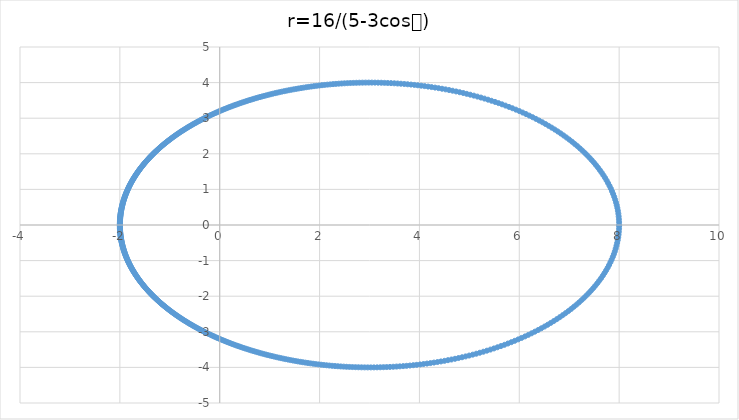
| Category | Series 0 |
|---|---|
| 8.0 | 0 |
| 7.999000083326431 | 0.08 |
| 7.9960013328917 | 0.16 |
| 7.991006744971623 | 0.24 |
| 7.984021305096987 | 0.32 |
| 7.975051975700377 | 0.399 |
| 7.964107678901756 | 0.478 |
| 7.95119927451213 | 0.557 |
| 7.936339533356246 | 0.636 |
| 7.919543106036231 | 0.715 |
| 7.900826487278052 | 0.793 |
| 7.880207976021677 | 0.87 |
| 7.85770763143369 | 0.947 |
| 7.83334722503755 | 1.024 |
| 7.807150189172043 | 1.1 |
| 7.779141562002014 | 1.176 |
| 7.749347929317744 | 1.251 |
| 7.717797363369854 | 1.325 |
| 7.684519358995629 | 1.398 |
| 7.649544767299798 | 1.471 |
| 7.612905727158514 | 1.543 |
| 7.574635594819063 | 1.614 |
| 7.534768871870203 | 1.685 |
| 7.493341131858488 | 1.755 |
| 7.450388945825134 | 1.823 |
| 7.405949807035291 | 1.891 |
| 7.360062055167811 | 1.958 |
| 7.312764800228125 | 2.024 |
| 7.264097846440236 | 2.089 |
| 7.214101616366028 | 2.153 |
| 7.162817075491111 | 2.216 |
| 7.110285657506487 | 2.278 |
| 7.056549190504545 | 2.338 |
| 7.001649824296235 | 2.398 |
| 6.945629959044046 | 2.457 |
| 6.888532175392632 | 2.515 |
| 6.830399166265657 | 2.571 |
| 6.771273670483854 | 2.626 |
| 6.711198408345566 | 2.681 |
| 6.650216019297045 | 2.734 |
| 6.588369001805932 | 2.786 |
| 6.525699655537476 | 2.836 |
| 6.462250025919277 | 2.886 |
| 6.398061851167021 | 2.934 |
| 6.333176511830353 | 2.982 |
| 6.26763498290546 | 3.028 |
| 6.201477788548398 | 3.073 |
| 6.134744959411527 | 3.116 |
| 6.067475992613994 | 3.159 |
| 5.999709814346535 | 3.2 |
| 5.931484745100645 | 3.24 |
| 5.862838467502768 | 3.279 |
| 5.793807996725204 | 3.317 |
| 5.724429653437246 | 3.354 |
| 5.654739039252534 | 3.39 |
| 5.58477101462171 | 3.424 |
| 5.514559679113258 | 3.457 |
| 5.444138354019811 | 3.49 |
| 5.373539567222341 | 3.521 |
| 5.302795040240249 | 3.551 |
| 5.231935677391793 | 3.579 |
| 5.160991556986063 | 3.607 |
| 5.089991924465212 | 3.634 |
| 5.01896518741366 | 3.659 |
| 4.947938912349361 | 3.684 |
| 4.87693982321131 | 3.707 |
| 4.805993801456769 | 3.73 |
| 4.735125887681586 | 3.751 |
| 4.664360284677105 | 3.772 |
| 4.59372036183784 | 3.791 |
| 4.52322866083485 | 3.81 |
| 4.452906902471033 | 3.827 |
| 4.382775994635963 | 3.844 |
| 4.312856041279559 | 3.86 |
| 4.243166352325852 | 3.874 |
| 4.17372545445011 | 3.888 |
| 4.104551102644868 | 3.901 |
| 4.03566029250281 | 3.913 |
| 3.967069273146864 | 3.924 |
| 3.898793560740561 | 3.935 |
| 3.830847952514242 | 3.944 |
| 3.763246541245501 | 3.953 |
| 3.69600273013495 | 3.961 |
| 3.629129248021127 | 3.968 |
| 3.562638164881205 | 3.975 |
| 3.496540907566835 | 3.98 |
| 3.430848275727262 | 3.985 |
| 3.3655704578745 | 3.989 |
| 3.300717047548056 | 3.993 |
| 3.236297059539306 | 3.996 |
| 3.172318946138137 | 3.998 |
| 3.108790613367034 | 3.999 |
| 3.045719437170157 | 4 |
| 2.98311227952733 | 4 |
| 2.920975504465138 | 4 |
| 2.859314993939508 | 3.998 |
| 2.798136163566281 | 3.997 |
| 2.737443978178282 | 3.994 |
| 2.677242967189345 | 3.992 |
| 2.617537239747617 | 3.988 |
| 2.558330499662216 | 3.984 |
| 2.499626060088969 | 3.98 |
| 2.441426857962642 | 3.975 |
| 2.38373546816446 | 3.97 |
| 2.326554117415242 | 3.964 |
| 2.269884697885776 | 3.957 |
| 2.21372878051733 | 3.95 |
| 2.158087628046377 | 3.943 |
| 2.102962207728762 | 3.935 |
| 2.048353203759508 | 3.927 |
| 1.994261029385514 | 3.918 |
| 1.940685838709213 | 3.909 |
| 1.887627538182174 | 3.9 |
| 1.83508579778834 | 3.89 |
| 1.783060061917342 | 3.88 |
| 1.73154955992899 | 3.869 |
| 1.680553316410609 | 3.858 |
| 1.630070161129488 | 3.847 |
| 1.580098738683143 | 3.835 |
| 1.530637517850628 | 3.823 |
| 1.481684800648471 | 3.811 |
| 1.433238731095203 | 3.799 |
| 1.385297303688793 | 3.786 |
| 1.337858371601562 | 3.773 |
| 1.290919654597419 | 3.759 |
| 1.244478746676498 | 3.745 |
| 1.198533123452443 | 3.731 |
| 1.153080149267762 | 3.717 |
| 1.108117084052829 | 3.703 |
| 1.063641089934184 | 3.688 |
| 1.019649237597914 | 3.673 |
| 0.976138512413934 | 3.658 |
| 0.933105820327067 | 3.642 |
| 0.890547993520809 | 3.627 |
| 0.848461795859741 | 3.611 |
| 0.806843928116486 | 3.595 |
| 0.765691032989141 | 3.578 |
| 0.72499969991506 | 3.562 |
| 0.684766469686844 | 3.545 |
| 0.64498783887633 | 3.529 |
| 0.605660264072313 | 3.512 |
| 0.566780165937688 | 3.494 |
| 0.528343933091595 | 3.477 |
| 0.490347925822092 | 3.46 |
| 0.452788479634787 | 3.442 |
| 0.415661908642756 | 3.424 |
| 0.378964508803 | 3.406 |
| 0.342692561004577 | 3.388 |
| 0.306842334013438 | 3.37 |
| 0.271410087278916 | 3.352 |
| 0.236392073606662 | 3.333 |
| 0.201784541702767 | 3.315 |
| 0.167583738593651 | 3.296 |
| 0.133785911926214 | 3.278 |
| 0.100387312152616 | 3.259 |
| 0.0673841946039558 | 3.24 |
| 0.0347728214569896 | 3.221 |
| 0.00254946359791953 | 3.202 |
| -0.0292895976128169 | 3.182 |
| -0.0607480686709527 | 3.163 |
| -0.0918296423502916 | 3.144 |
| -0.122537996212512 | 3.124 |
| -0.152876791201394 | 3.105 |
| -0.182849670318087 | 3.085 |
| -0.212460257374163 | 3.065 |
| -0.241712155819265 | 3.045 |
| -0.270608947640309 | 3.026 |
| -0.299154192329247 | 3.006 |
| -0.32735142591655 | 2.986 |
| -0.355204160067608 | 2.966 |
| -0.38271588123939 | 2.946 |
| -0.40989004989476 | 2.925 |
| -0.436730099771957 | 2.905 |
| -0.463239437206823 | 2.885 |
| -0.489421440505444 | 2.865 |
| -0.515279459364973 | 2.845 |
| -0.540816814340458 | 2.824 |
| -0.566036796355586 | 2.804 |
| -0.590942666255347 | 2.783 |
| -0.61553765439866 | 2.763 |
| -0.639824960289117 | 2.742 |
| -0.663807752242032 | 2.722 |
| -0.687489167086079 | 2.701 |
| -0.710872309897848 | 2.681 |
| -0.733960253767731 | 2.66 |
| -0.756756039595591 | 2.64 |
| -0.779262675914741 | 2.619 |
| -0.801483138742811 | 2.598 |
| -0.82342037145815 | 2.578 |
| -0.845077284700431 | 2.557 |
| -0.866456756294225 | 2.536 |
| -0.887561631194328 | 2.515 |
| -0.908394721451674 | 2.495 |
| -0.928958806198736 | 2.474 |
| -0.949256631653348 | 2.453 |
| -0.969290911139911 | 2.432 |
| -0.989064325127025 | 2.412 |
| -1.008579521280597 | 2.391 |
| -1.02783911453152 | 2.37 |
| -1.046845687157074 | 2.349 |
| -1.06560178887522 | 2.328 |
| -1.08410993695099 | 2.308 |
| -1.102372616314229 | 2.287 |
| -1.120392279687954 | 2.266 |
| -1.138171347726648 | 2.245 |
| -1.155712209163827 | 2.224 |
| -1.173017220968233 | 2.203 |
| -1.190088708508073 | 2.183 |
| -1.206928965722706 | 2.162 |
| -1.223540255301232 | 2.141 |
| -1.239924808867465 | 2.12 |
| -1.25608482717077 | 2.099 |
| -1.272022480282303 | 2.078 |
| -1.287739907796181 | 2.058 |
| -1.30323921903515 | 2.037 |
| -1.31852249326034 | 2.016 |
| -1.333591779884699 | 1.995 |
| -1.348449098689737 | 1.974 |
| -1.363096440045217 | 1.954 |
| -1.377535765131444 | 1.933 |
| -1.391769006163834 | 1.912 |
| -1.405798066619444 | 1.891 |
| -1.419624821465179 | 1.871 |
| -1.433251117387374 | 1.85 |
| -1.446678773022507 | 1.829 |
| -1.459909579188773 | 1.808 |
| -1.472945299118284 | 1.788 |
| -1.485787668689663 | 1.767 |
| -1.498438396660819 | 1.746 |
| -1.510899164901693 | 1.725 |
| -1.523171628626774 | 1.705 |
| -1.535257416627222 | 1.684 |
| -1.547158131502385 | 1.663 |
| -1.558875349890582 | 1.643 |
| -1.570410622698972 | 1.622 |
| -1.581765475332368 | 1.601 |
| -1.592941407920847 | 1.581 |
| -1.603939895546044 | 1.56 |
| -1.614762388465974 | 1.54 |
| -1.625410312338298 | 1.519 |
| -1.635885068441889 | 1.498 |
| -1.646188033896617 | 1.478 |
| -1.656320561881245 | 1.457 |
| -1.666283981849342 | 1.437 |
| -1.676079599743127 | 1.416 |
| -1.685708698205162 | 1.396 |
| -1.695172536787823 | 1.375 |
| -1.704472352160464 | 1.355 |
| -1.713609358314217 | 1.334 |
| -1.722584746764367 | 1.314 |
| -1.731399686750231 | 1.293 |
| -1.740055325432494 | 1.273 |
| -1.748552788087957 | 1.253 |
| -1.756893178301636 | 1.232 |
| -1.765077578156173 | 1.212 |
| -1.773107048418526 | 1.191 |
| -1.780982628723888 | 1.171 |
| -1.788705337756806 | 1.151 |
| -1.796276173429467 | 1.13 |
| -1.803696113057123 | 1.11 |
| -1.810966113530622 | 1.089 |
| -1.818087111486025 | 1.069 |
| -1.825060023471289 | 1.049 |
| -1.831885746109981 | 1.029 |
| -1.838565156262027 | 1.008 |
| -1.845099111181452 | 0.988 |
| -1.851488448671123 | 0.968 |
| -1.85773398723446 | 0.947 |
| -1.863836526224112 | 0.927 |
| -1.869796845987584 | 0.907 |
| -1.875615708009815 | 0.887 |
| -1.881293855052686 | 0.866 |
| -1.886832011291454 | 0.846 |
| -1.89223088244811 | 0.826 |
| -1.897491155921661 | 0.806 |
| -1.902613500915314 | 0.786 |
| -1.907598568560578 | 0.765 |
| -1.912446992038271 | 0.745 |
| -1.917159386696434 | 0.725 |
| -1.921736350165148 | 0.705 |
| -1.926178462468256 | 0.685 |
| -1.930486286131997 | 0.665 |
| -1.934660366290532 | 0.645 |
| -1.938701230788387 | 0.624 |
| -1.942609390279804 | 0.604 |
| -1.946385338324997 | 0.584 |
| -1.950029551483328 | 0.564 |
| -1.953542489403386 | 0.544 |
| -1.956924594910001 | 0.524 |
| -1.960176294088164 | 0.504 |
| -1.963297996363878 | 0.484 |
| -1.966290094581938 | 0.464 |
| -1.969152965080639 | 0.444 |
| -1.971886967763417 | 0.424 |
| -1.974492446167435 | 0.404 |
| -1.976969727529102 | 0.383 |
| -1.979319122846547 | 0.363 |
| -1.981540926939035 | 0.343 |
| -1.983635418503334 | 0.323 |
| -1.98560286016705 | 0.303 |
| -1.987443498538906 | 0.283 |
| -1.989157564255999 | 0.263 |
| -1.990745272028008 | 0.243 |
| -1.992206820678387 | 0.223 |
| -1.993542393182515 | 0.203 |
| -1.994752156702835 | 0.183 |
| -1.995836262620958 | 0.163 |
| -1.996794846566756 | 0.143 |
| -1.997628028444435 | 0.123 |
| -1.998335912455587 | 0.103 |
| -1.998918587119235 | 0.083 |
| -1.999376125288862 | 0.063 |
| -1.999708584166431 | 0.043 |
| -1.999916005313388 | 0.023 |
| -1.999998414658671 | 0.003 |
| -1.99995582250369 | -0.017 |
| -1.99978822352432 | -0.037 |
| -1.999495596769871 | -0.057 |
| -1.999077905659052 | -0.077 |
| -1.998535097972939 | -0.097 |
| -1.997867105844915 | -0.117 |
| -1.997073845747619 | -0.137 |
| -1.99615521847687 | -0.157 |
| -1.995111109132584 | -0.177 |
| -1.993941387096685 | -0.197 |
| -1.992645906007986 | -0.217 |
| -1.991224503734066 | -0.237 |
| -1.98967700234012 | -0.257 |
| -1.988003208054789 | -0.277 |
| -1.986202911232971 | -0.297 |
| -1.984275886315596 | -0.317 |
| -1.982221891786376 | -0.337 |
| -1.980040670125527 | -0.357 |
| -1.977731947760442 | -0.377 |
| -1.975295435013341 | -0.397 |
| -1.972730826045865 | -0.417 |
| -1.970037798800629 | -0.437 |
| -1.967216014939728 | -0.457 |
| -1.964265119780182 | -0.477 |
| -1.961184742226334 | -0.497 |
| -1.95797449469918 | -0.518 |
| -1.954633973062634 | -0.538 |
| -1.951162756546734 | -0.558 |
| -1.947560407667765 | -0.578 |
| -1.943826472145317 | -0.598 |
| -1.939960478816261 | -0.618 |
| -1.93596193954564 | -0.638 |
| -1.931830349134487 | -0.658 |
| -1.927565185224543 | -0.678 |
| -1.923165908199897 | -0.699 |
| -1.91863196108553 | -0.719 |
| -1.913962769442765 | -0.739 |
| -1.909157741261626 | -0.759 |
| -1.904216266850101 | -0.779 |
| -1.899137718720309 | -0.799 |
| -1.893921451471573 | -0.82 |
| -1.8885668016704 | -0.84 |
| -1.88307308772736 | -0.86 |
| -1.877439609770888 | -0.88 |
| -1.871665649517986 | -0.9 |
| -1.865750470141846 | -0.921 |
| -1.859693316136392 | -0.941 |
| -1.853493413177754 | -0.961 |
| -1.847149967982666 | -0.981 |
| -1.840662168163807 | -1.002 |
| -1.834029182082099 | -1.022 |
| -1.827250158695959 | -1.042 |
| -1.82032422740752 | -1.063 |
| -1.813250497905845 | -1.083 |
| -1.806028060007136 | -1.103 |
| -1.798655983491958 | -1.124 |
| -1.791133317939506 | -1.144 |
| -1.783459092558915 | -1.164 |
| -1.775632316017655 | -1.185 |
| -1.76765197626703 | -1.205 |
| -1.759517040364794 | -1.226 |
| -1.751226454294933 | -1.246 |
| -1.742779142784637 | -1.266 |
| -1.734174009118485 | -1.287 |
| -1.725409934949898 | -1.307 |
| -1.716485780109891 | -1.328 |
| -1.707400382413165 | -1.348 |
| -1.69815255746159 | -1.369 |
| -1.688741098445125 | -1.389 |
| -1.679164775940243 | -1.41 |
| -1.669422337705886 | -1.43 |
| -1.659512508477051 | -1.451 |
| -1.649433989756047 | -1.471 |
| -1.6391854596015 | -1.492 |
| -1.628765572415189 | -1.513 |
| -1.618172958726776 | -1.533 |
| -1.60740622497654 | -1.554 |
| -1.596463953296177 | -1.574 |
| -1.585344701287795 | -1.595 |
| -1.574047001801171 | -1.616 |
| -1.562569362709421 | -1.636 |
| -1.550910266683154 | -1.657 |
| -1.539068170963273 | -1.677 |
| -1.527041507132524 | -1.698 |
| -1.514828680885951 | -1.719 |
| -1.502428071800386 | -1.74 |
| -1.489838033103152 | -1.76 |
| -1.477056891440107 | -1.781 |
| -1.464082946643241 | -1.802 |
| -1.450914471497978 | -1.822 |
| -1.437549711510389 | -1.843 |
| -1.42398688467452 | -1.864 |
| -1.410224181240038 | -1.885 |
| -1.396259763480436 | -1.905 |
| -1.382091765462016 | -1.926 |
| -1.367718292813919 | -1.947 |
| -1.353137422499452 | -1.968 |
| -1.338347202588989 | -1.989 |
| -1.323345652034748 | -2.009 |
| -1.308130760447739 | -2.03 |
| -1.292700487877208 | -2.051 |
| -1.277052764592919 | -2.072 |
| -1.261185490870622 | -2.093 |
| -1.245096536781088 | -2.113 |
| -1.22878374198309 | -2.134 |
| -1.212244915520759 | -2.155 |
| -1.19547783562572 | -2.176 |
| -1.178480249524487 | -2.197 |
| -1.161249873251566 | -2.218 |
| -1.143784391468778 | -2.238 |
| -1.126081457291313 | -2.259 |
| -1.10813869212106 | -2.28 |
| -1.089953685487786 | -2.301 |
| -1.07152399489875 | -2.322 |
| -1.052847145697391 | -2.343 |
| -1.033920630931727 | -2.363 |
| -1.014741911233156 | -2.384 |
| -0.995308414706367 | -2.405 |
| -0.97561753683111 | -2.426 |
| -0.955666640376606 | -2.447 |
| -0.935453055329395 | -2.467 |
| -0.914974078835499 | -2.488 |
| -0.894226975157757 | -2.509 |
| -0.873208975649286 | -2.53 |
| -0.851917278744005 | -2.55 |
| -0.830349049965263 | -2.571 |
| -0.808501421953592 | -2.592 |
| -0.786371494514703 | -2.612 |
| -0.763956334688854 | -2.633 |
| -0.741252976842795 | -2.654 |
| -0.718258422785515 | -2.674 |
| -0.694969641909098 | -2.695 |
| -0.671383571356027 | -2.715 |
| -0.647497116214339 | -2.736 |
| -0.623307149742092 | -2.756 |
| -0.598810513622652 | -2.777 |
| -0.574004018252402 | -2.797 |
| -0.548884443062481 | -2.818 |
| -0.52344853687629 | -2.838 |
| -0.497693018304523 | -2.858 |
| -0.471614576179571 | -2.879 |
| -0.445209870031205 | -2.899 |
| -0.418475530605537 | -2.919 |
| -0.391408160429318 | -2.939 |
| -0.364004334421704 | -2.959 |
| -0.33626060055572 | -2.979 |
| -0.308173480571727 | -2.999 |
| -0.279739470745259 | -3.019 |
| -0.250955042711729 | -3.039 |
| -0.221816644350543 | -3.059 |
| -0.19232070073128 | -3.079 |
| -0.16246361512469 | -3.098 |
| -0.132241770081334 | -3.118 |
| -0.101651528580815 | -3.137 |
| -0.0706892352546303 | -3.157 |
| -0.0393512176857691 | -3.176 |
| -0.00763378778831567 | -3.195 |
| 0.0244667567296213 | -3.215 |
| 0.0569541308161923 | -3.234 |
| 0.0898320604357533 | -3.253 |
| 0.123104280834808 | -3.272 |
| 0.156774534710172 | -3.29 |
| 0.190846570275474 | -3.309 |
| 0.225324139221993 | -3.328 |
| 0.260210994569723 | -3.346 |
| 0.29551088840444 | -3.364 |
| 0.331227569496435 | -3.383 |
| 0.367364780796461 | -3.401 |
| 0.403926256804331 | -3.419 |
| 0.440915720805486 | -3.436 |
| 0.478336881970762 | -3.454 |
| 0.516193432314439 | -3.472 |
| 0.554489043505587 | -3.489 |
| 0.593227363527592 | -3.506 |
| 0.632412013180652 | -3.523 |
| 0.672046582421945 | -3.54 |
| 0.71213462653806 | -3.557 |
| 0.752679662144198 | -3.573 |
| 0.793685163004587 | -3.59 |
| 0.835154555668438 | -3.606 |
| 0.877091214915746 | -3.622 |
| 0.919498459007143 | -3.637 |
| 0.962379544731965 | -3.653 |
| 1.00573766224868 | -3.668 |
| 1.049575929711753 | -3.683 |
| 1.093897387679021 | -3.698 |
| 1.138704993293672 | -3.713 |
| 1.184001614234882 | -3.727 |
| 1.229790022431232 | -3.741 |
| 1.276072887531049 | -3.755 |
| 1.322852770123885 | -3.768 |
| 1.370132114707423 | -3.782 |
| 1.417913242394228 | -3.794 |
| 1.46619834335284 | -3.807 |
| 1.514989468977937 | -3.82 |
| 1.5642885237844 | -3.832 |
| 1.614097257020389 | -3.843 |
| 1.664417253994732 | -3.855 |
| 1.715249927114268 | -3.866 |
| 1.766596506627028 | -3.876 |
| 1.81845803106756 | -3.887 |
| 1.870835337401065 | -3.897 |
| 1.92372905086343 | -3.906 |
| 1.977139574494804 | -3.915 |
| 2.031067078364788 | -3.924 |
| 2.085511488488001 | -3.933 |
| 2.140472475429343 | -3.94 |
| 2.195949442599027 | -3.948 |
| 2.251941514238148 | -3.955 |
| 2.308447523096448 | -3.962 |
| 2.365465997804732 | -3.968 |
| 2.422995149945417 | -3.973 |
| 2.481032860825643 | -3.978 |
| 2.539576667958519 | -3.983 |
| 2.598623751259213 | -3.987 |
| 2.658170918963838 | -3.991 |
| 2.718214593280404 | -3.994 |
| 2.778750795782532 | -3.996 |
| 2.839775132558064 | -3.998 |
| 2.901282779126312 | -3.999 |
| 2.963268465139319 | -4 |
| 3.025726458884242 | -4 |
| 3.088650551605817 | -3.999 |
| 3.152034041669744 | -3.998 |
| 3.215869718589841 | -3.996 |
| 3.280149846943927 | -3.994 |
| 3.3448661502055 | -3.99 |
| 3.410009794520587 | -3.987 |
| 3.475571372461427 | -3.982 |
| 3.541540886791079 | -3.976 |
| 3.60790773427548 | -3.97 |
| 3.674660689582077 | -3.963 |
| 3.741787889306681 | -3.956 |
| 3.8092768161729 | -3.947 |
| 3.877114283451184 | -3.938 |
| 3.945286419647197 | -3.928 |
| 4.013778653512078 | -3.917 |
| 4.08257569942981 | -3.905 |
| 4.151661543239755 | -3.892 |
| 4.221019428555139 | -3.879 |
| 4.290631843640966 | -3.864 |
| 4.360480508917555 | -3.849 |
| 4.43054636515846 | -3.833 |
| 4.500809562454081 | -3.816 |
| 4.57124945001468 | -3.797 |
| 4.641844566888801 | -3.778 |
| 4.712572633675231 | -3.758 |
| 4.783410545308608 | -3.737 |
| 4.854334365000532 | -3.715 |
| 4.925319319419556 | -3.692 |
| 4.996339795194725 | -3.667 |
| 5.067369336828301 | -3.642 |
| 5.138380646103979 | -3.616 |
| 5.20934558307723 | -3.588 |
| 5.280235168734368 | -3.56 |
| 5.351019589406453 | -3.53 |
| 5.421668203023228 | -3.5 |
| 5.492149547291004 | -3.468 |
| 5.562431349876444 | -3.435 |
| 5.632480540675895 | -3.401 |
| 5.702263266246928 | -3.365 |
| 5.771744906475268 | -3.329 |
| 5.84089009354617 | -3.292 |
| 5.90966273328457 | -3.253 |
| 5.978026028923008 | -3.213 |
| 6.045942507350223 | -3.172 |
| 6.113374047886795 | -3.13 |
| 6.180281913626711 | -3.087 |
| 6.246626785375872 | -3.042 |
| 6.312368798209805 | -2.996 |
| 6.377467580663606 | -2.949 |
| 6.441882296557144 | -2.901 |
| 6.50557168944806 | -2.852 |
| 6.568494129693902 | -2.802 |
| 6.630607664093115 | -2.75 |
| 6.691870068062386 | -2.698 |
| 6.752238900295208 | -2.644 |
| 6.811671559833527 | -2.589 |
| 6.870125345470909 | -2.533 |
| 6.9275575173921 | -2.475 |
| 6.983925360939994 | -2.417 |
| 7.039186252387128 | -2.358 |
| 7.09329772657489 | -2.297 |
| 7.146217546269808 | -2.236 |
| 7.197903773072646 | -2.173 |
| 7.248314839702607 | -2.109 |
| 7.29740962346611 | -2.045 |
| 7.345147520707047 | -1.979 |
| 7.391488522023675 | -1.912 |
| 7.436393288026237 | -1.845 |
| 7.47982322539906 | -1.777 |
| 7.521740563021791 | -1.707 |
| 7.56210842789603 | -1.637 |
| 7.600890920616774 | -1.566 |
| 7.638053190122137 | -1.494 |
| 7.673561507450587 | -1.422 |
| 7.707383338231764 | -1.348 |
| 7.739487413635672 | -1.274 |
| 7.769843799504995 | -1.2 |
| 7.798423963397076 | -1.124 |
| 7.825200839265419 | -1.048 |
| 7.850148889515723 | -0.972 |
| 7.873244164178007 | -0.895 |
| 7.894464356945001 | -0.817 |
| 7.913788857836836 | -0.74 |
| 7.93119880226389 | -0.661 |
| 7.946677116272773 | -0.583 |
| 7.960208557775199 | -0.504 |
| 7.971779753575622 | -0.424 |
| 7.981379232030947 | -0.345 |
| 7.988997451194214 | -0.265 |
| 7.994626822313952 | -0.185 |
| 7.998261728581436 | -0.105 |
| 7.999898539039577 | -0.025 |